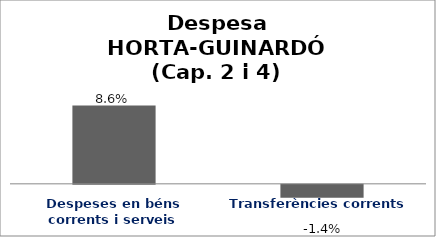
| Category | Series 0 |
|---|---|
| Despeses en béns corrents i serveis | 0.086 |
| Transferències corrents | -0.014 |